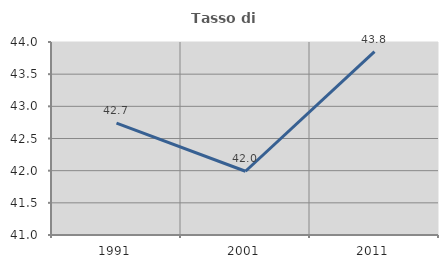
| Category | Tasso di occupazione   |
|---|---|
| 1991.0 | 42.739 |
| 2001.0 | 41.991 |
| 2011.0 | 43.849 |